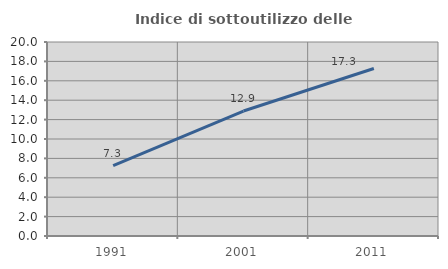
| Category | Indice di sottoutilizzo delle abitazioni  |
|---|---|
| 1991.0 | 7.264 |
| 2001.0 | 12.883 |
| 2011.0 | 17.269 |